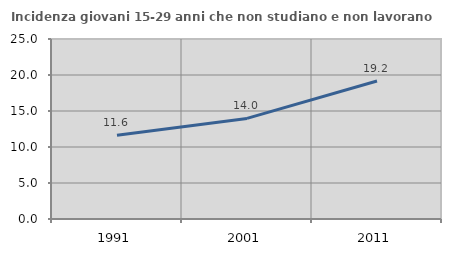
| Category | Incidenza giovani 15-29 anni che non studiano e non lavorano  |
|---|---|
| 1991.0 | 11.62 |
| 2001.0 | 13.968 |
| 2011.0 | 19.167 |